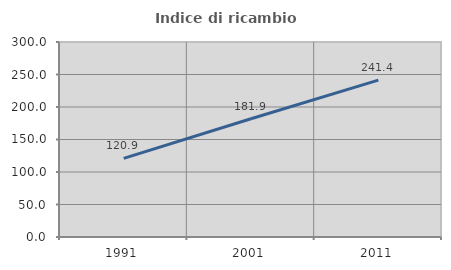
| Category | Indice di ricambio occupazionale  |
|---|---|
| 1991.0 | 120.909 |
| 2001.0 | 181.876 |
| 2011.0 | 241.446 |